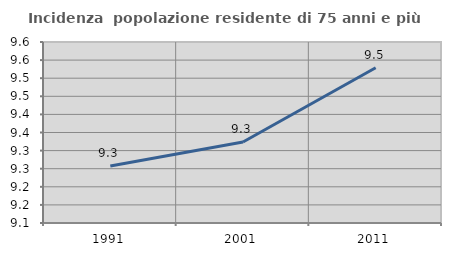
| Category | Incidenza  popolazione residente di 75 anni e più |
|---|---|
| 1991.0 | 9.257 |
| 2001.0 | 9.324 |
| 2011.0 | 9.529 |